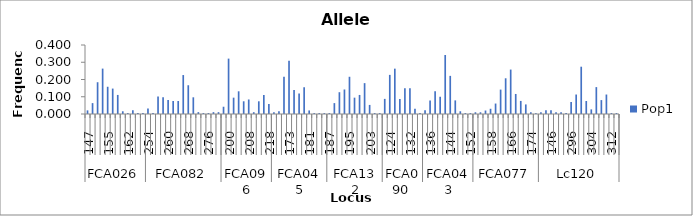
| Category | Pop1 |
|---|---|
| 0 | 0.021 |
| 1 | 0.063 |
| 2 | 0.184 |
| 3 | 0.263 |
| 4 | 0.158 |
| 5 | 0.147 |
| 6 | 0.111 |
| 7 | 0.016 |
| 8 | 0.005 |
| 9 | 0.021 |
| 10 | 0.005 |
| 11 | 0.005 |
| 12 | 0.032 |
| 13 | 0.005 |
| 14 | 0.102 |
| 15 | 0.097 |
| 16 | 0.081 |
| 17 | 0.075 |
| 18 | 0.075 |
| 19 | 0.226 |
| 20 | 0.167 |
| 21 | 0.097 |
| 22 | 0.011 |
| 23 | 0.005 |
| 24 | 0.005 |
| 25 | 0.011 |
| 26 | 0.011 |
| 27 | 0.042 |
| 28 | 0.321 |
| 29 | 0.095 |
| 30 | 0.132 |
| 31 | 0.074 |
| 32 | 0.084 |
| 33 | 0.011 |
| 34 | 0.074 |
| 35 | 0.111 |
| 36 | 0.058 |
| 37 | 0.01 |
| 38 | 0.015 |
| 39 | 0.216 |
| 40 | 0.309 |
| 41 | 0.139 |
| 42 | 0.119 |
| 43 | 0.155 |
| 44 | 0.021 |
| 45 | 0.005 |
| 46 | 0.005 |
| 47 | 0.005 |
| 48 | 0.005 |
| 49 | 0.063 |
| 50 | 0.126 |
| 51 | 0.142 |
| 52 | 0.216 |
| 53 | 0.095 |
| 54 | 0.111 |
| 55 | 0.179 |
| 56 | 0.053 |
| 57 | 0.005 |
| 58 | 0.005 |
| 59 | 0.088 |
| 60 | 0.227 |
| 61 | 0.263 |
| 62 | 0.088 |
| 63 | 0.149 |
| 64 | 0.149 |
| 65 | 0.031 |
| 66 | 0.005 |
| 67 | 0.021 |
| 68 | 0.079 |
| 69 | 0.132 |
| 70 | 0.1 |
| 71 | 0.342 |
| 72 | 0.221 |
| 73 | 0.079 |
| 74 | 0.016 |
| 75 | 0.005 |
| 76 | 0.005 |
| 77 | 0.01 |
| 78 | 0.01 |
| 79 | 0.02 |
| 80 | 0.03 |
| 81 | 0.061 |
| 82 | 0.141 |
| 83 | 0.207 |
| 84 | 0.258 |
| 85 | 0.116 |
| 86 | 0.076 |
| 87 | 0.056 |
| 88 | 0.01 |
| 89 | 0.005 |
| 90 | 0.011 |
| 91 | 0.022 |
| 92 | 0.022 |
| 93 | 0.011 |
| 94 | 0.011 |
| 95 | 0.005 |
| 96 | 0.07 |
| 97 | 0.113 |
| 98 | 0.274 |
| 99 | 0.075 |
| 100 | 0.027 |
| 101 | 0.156 |
| 102 | 0.081 |
| 103 | 0.113 |
| 104 | 0.005 |
| 105 | 0.005 |